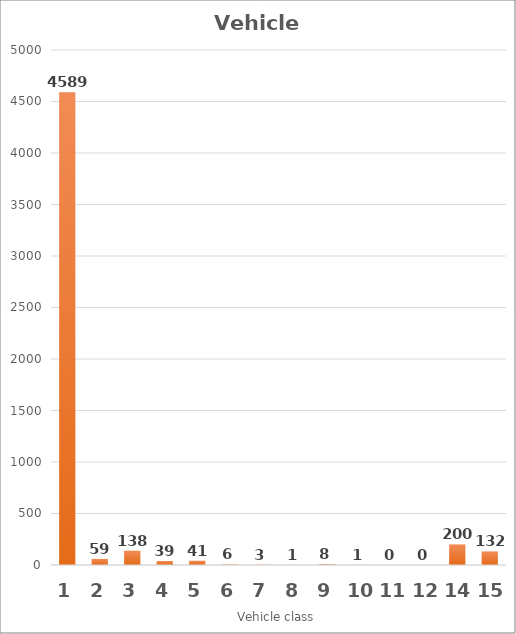
| Category | Series 0 |
|---|---|
| 1.0 | 4589 |
| 2.0 | 59 |
| 3.0 | 138 |
| 4.0 | 39 |
| 5.0 | 41 |
| 6.0 | 6 |
| 7.0 | 3 |
| 8.0 | 1 |
| 9.0 | 8 |
| 10.0 | 1 |
| 11.0 | 0 |
| 12.0 | 0 |
| 14.0 | 200 |
| 15.0 | 132 |